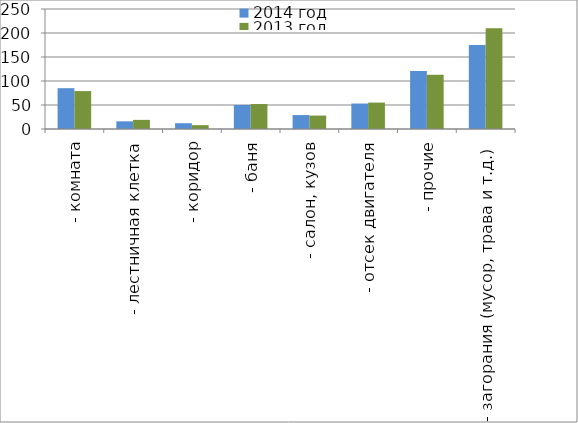
| Category | 2014 год | 2013 год |
|---|---|---|
|  - комната | 85 | 79 |
|  - лестничная клетка | 16 | 19 |
|  - коридор | 12 | 8 |
|  - баня | 50 | 52 |
|  - салон, кузов | 29 | 28 |
|  - отсек двигателя | 53 | 55 |
| - прочие | 121 | 113 |
| - загорания (мусор, трава и т.д.)  | 175 | 210 |